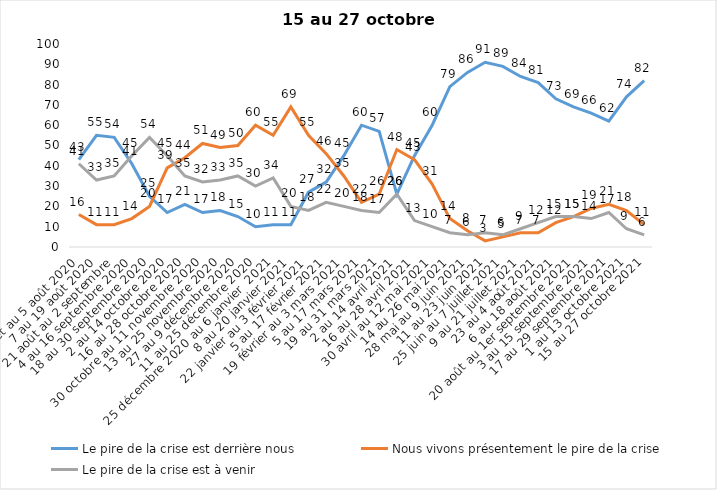
| Category | Le pire de la crise est derrière nous | Nous vivons présentement le pire de la crise | Le pire de la crise est à venir |
|---|---|---|---|
| 24 juillet au 5 août 2020 | 43 | 16 | 41 |
| 7 au 19 août 2020 | 55 | 11 | 33 |
| 21 août au 2 septembre | 54 | 11 | 35 |
| 4 au 16 septembre 2020 | 41 | 14 | 45 |
| 18 au 30 septembre 2020 | 25 | 20 | 54 |
| 2 au 14 octobre 2020 | 17 | 39 | 45 |
| 16 au 28 octobre 2020 | 21 | 44 | 35 |
| 30 octobre au 11 novembre 2020 | 17 | 51 | 32 |
| 13 au 25 novembre 2020 | 18 | 49 | 33 |
| 27 au 9 décembre 2020 | 15 | 50 | 35 |
| 11 au 25 décembre 2020 | 10 | 60 | 30 |
| 25 décembre 2020 au 6 janvier  2021 | 11 | 55 | 34 |
| 8 au 20 janvier 2021 | 11 | 69 | 20 |
| 22 janvier au 3 février 2021 | 27 | 55 | 18 |
| 5 au 17 février 2021 | 32 | 46 | 22 |
| 19 février au 3 mars 2021 | 45 | 35 | 20 |
| 5 au 17 mars 2021 | 60 | 22 | 18 |
| 19 au 31 mars 2021 | 57 | 26 | 17 |
| 2 au 14 avril 2021 | 26 | 48 | 26 |
| 16 au 28 avril 2021 | 45 | 43 | 13 |
| 30 avril au 12 mai 2021 | 60 | 31 | 10 |
| 14 au 26 mai 2021 | 79 | 14 | 7 |
| 28 mai au 9 juin 2021 | 86 | 8 | 6 |
| 11 au 23 juin 2021 | 91 | 3 | 7 |
| 25 juin au 7 juillet 2021 | 89 | 5 | 6 |
| 9 au 21 juillet 2021 | 84 | 7 | 9 |
| 23 au 4 août 2021 | 81 | 7 | 12 |
| 6 au 18 août 2021 | 73 | 12 | 15 |
| 20 août au 1er septembre 2021 | 69 | 15 | 15 |
| 3 au 15 septembre 2021 | 66 | 19 | 14 |
| 17 au 29 septembre 2021 | 62 | 21 | 17 |
| 1 au 13 octobre 2021 | 74 | 18 | 9 |
| 15 au 27 octobre 2021 | 82 | 11 | 6 |